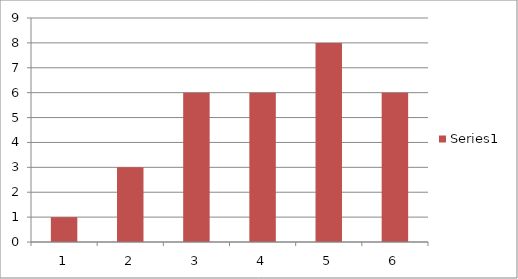
| Category | Series 1 |
|---|---|
| 0 | 1 |
| 1 | 3 |
| 2 | 6 |
| 3 | 6 |
| 4 | 8 |
| 5 | 6 |